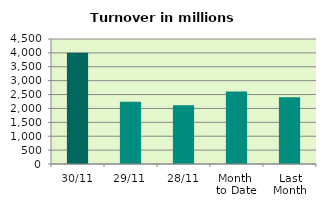
| Category | Series 0 |
|---|---|
| 30/11 | 4006.797 |
| 29/11 | 2244.109 |
| 28/11 | 2118.065 |
| Month 
to Date | 2611.78 |
| Last
Month | 2399.244 |